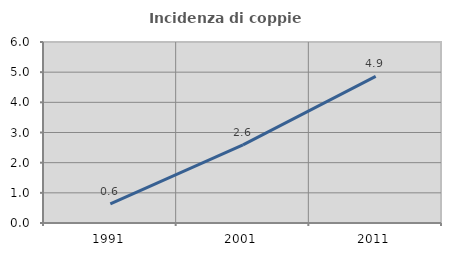
| Category | Incidenza di coppie miste |
|---|---|
| 1991.0 | 0.635 |
| 2001.0 | 2.589 |
| 2011.0 | 4.858 |